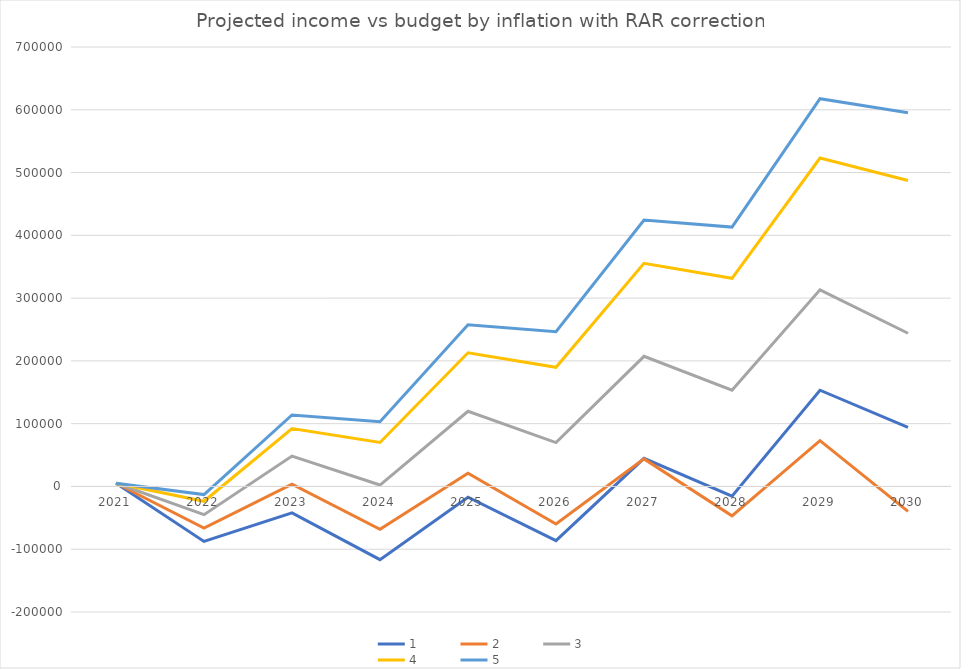
| Category | 1 | 2 | 3 | 4 | 5 |
|---|---|---|---|---|---|
| 2021.0 | 5137.343 | 5137.343 | 5137.343 | 5137.343 | 5137.343 |
| 2022.0 | -87582.142 | -66265.022 | -44947.902 | -23630.782 | -12972.222 |
| 2023.0 | -42024.997 | 3593.64 | 48359.592 | 92272.859 | 113909.736 |
| 2024.0 | -116617.863 | -68262.108 | 2246.398 | 70094.528 | 103036.939 |
| 2025.0 | -17089.474 | 20989.553 | 119707.431 | 212891.384 | 257474.168 |
| 2026.0 | -86274.357 | -59747.565 | 69831.4 | 189817.047 | 246382.828 |
| 2027.0 | 44853.585 | 43914.334 | 207203.573 | 355524.469 | 424423.819 |
| 2028.0 | -15586.329 | -46801.893 | 153257.658 | 331517.93 | 413109.543 |
| 2029.0 | 153299.612 | 73067.981 | 313182.981 | 523060.333 | 617711.198 |
| 2030.0 | 93967.94 | -39635.015 | 244060.835 | 487309.685 | 595395.26 |